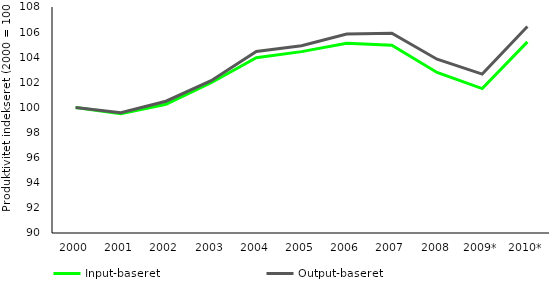
| Category | Input-baseret | Output-baseret |
|---|---|---|
| 2000 | 100 | 100 |
| 2001 | 99.498 | 99.584 |
| 2002 | 100.258 | 100.496 |
| 2003 | 101.964 | 102.134 |
| 2004 | 103.955 | 104.456 |
| 2005 | 104.447 | 104.91 |
| 2006 | 105.118 | 105.844 |
| 2007 | 104.963 | 105.912 |
| 2008 | 102.784 | 103.843 |
| 2009* | 101.501 | 102.659 |
| 2010* | 105.219 | 106.442 |